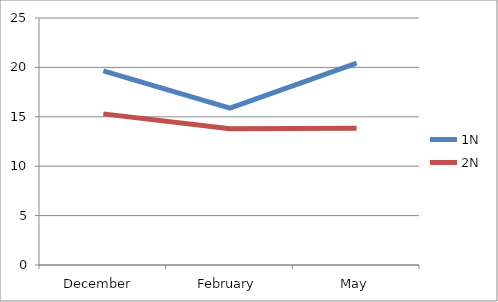
| Category | 1N | 2N |
|---|---|---|
| December  | 19.648 | 15.295 |
| February | 15.875 | 13.784 |
| May | 20.432 | 13.833 |